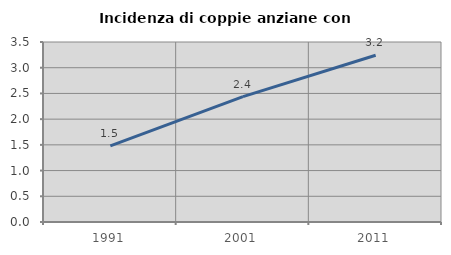
| Category | Incidenza di coppie anziane con figli |
|---|---|
| 1991.0 | 1.48 |
| 2001.0 | 2.437 |
| 2011.0 | 3.241 |